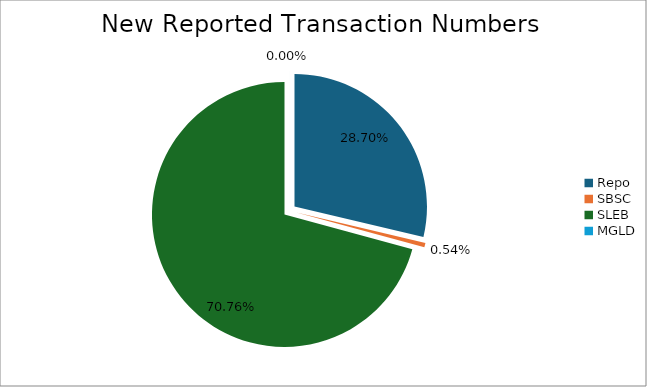
| Category | Series 0 |
|---|---|
| Repo | 347146 |
| SBSC | 6491 |
| SLEB | 855835 |
| MGLD | 11 |